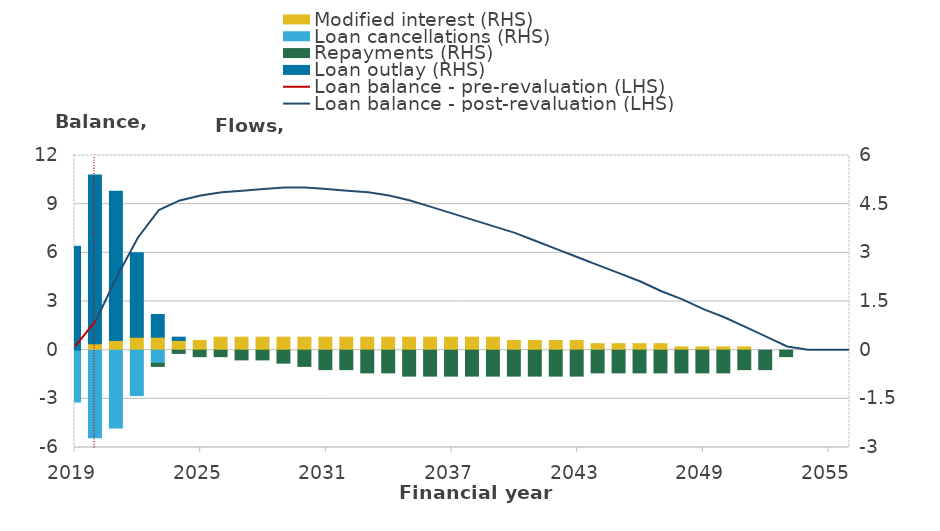
| Category | Modified interest (RHS) | Loan cancellations (RHS) | Repayments (RHS) | Loan outlay (RHS) |
|---|---|---|---|---|
| 2017-18 | 0 | -1.6 | 0 | 3.2 |
| 2018-19 | 0.2 | -2.7 | 0 | 5.2 |
| 2019-20 | 0.3 | -2.4 | 0 | 4.6 |
| 2020-21 | 0.4 | -1.4 | 0 | 2.6 |
| 2021-22 | 0.4 | -0.4 | -0.1 | 0.7 |
| 2022-23 | 0.3 | 0 | -0.1 | 0.1 |
| 2023-24 | 0.3 | 0 | -0.2 | 0 |
| 2024-25 | 0.4 | 0 | -0.2 | 0 |
| 2025-26 | 0.4 | 0 | -0.3 | 0 |
| 2026-27 | 0.4 | 0 | -0.3 | 0 |
| 2027-28 | 0.4 | 0 | -0.4 | 0 |
| 2028-29 | 0.4 | 0 | -0.5 | 0 |
| 2029-30 | 0.4 | 0 | -0.6 | 0 |
| 2030-31 | 0.4 | 0 | -0.6 | 0 |
| 2031-32 | 0.4 | 0 | -0.7 | 0 |
| 2032-33 | 0.4 | 0 | -0.7 | 0 |
| 2033-34 | 0.4 | 0 | -0.8 | 0 |
| 2034-35 | 0.4 | 0 | -0.8 | 0 |
| 2035-36 | 0.4 | 0 | -0.8 | 0 |
| 2036-37 | 0.4 | 0 | -0.8 | 0 |
| 2037-38 | 0.4 | 0 | -0.8 | 0 |
| 2038-39 | 0.3 | 0 | -0.8 | 0 |
| 2039-40 | 0.3 | 0 | -0.8 | 0 |
| 2040-41 | 0.3 | 0 | -0.8 | 0 |
| 2041-42 | 0.3 | 0 | -0.8 | 0 |
| 2042-43 | 0.2 | 0 | -0.7 | 0 |
| 2043-44 | 0.2 | 0 | -0.7 | 0 |
| 2044-45 | 0.2 | 0 | -0.7 | 0 |
| 2045-46 | 0.2 | 0 | -0.7 | 0 |
| 2046-47 | 0.1 | 0 | -0.7 | 0 |
| 2047-48 | 0.1 | 0 | -0.7 | 0 |
| 2048-49 | 0.1 | 0 | -0.7 | 0 |
| 2049-50 | 0.1 | 0 | -0.6 | 0 |
| 2050-51 | 0 | 0 | -0.6 | 0 |
| 2051-52 | 0 | 0 | -0.2 | 0 |
| 2052-53 | 0 | 0 | 0 | 0 |
| 2053-54 | 0 | 0 | 0 | 0 |
| 2054-55 | 0 | 0 | 0 | 0 |